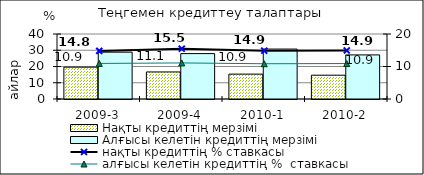
| Category | Нақты кредиттің мерзімі  | Алғысы келетін кредиттің мерзімі  |
|---|---|---|
| 2009-3 | 19.59 | 28.82 |
| 2009-4 | 16.65 | 27.94 |
| 2010-1 | 15.31 | 30.74 |
| 2010-2 | 14.65 | 27.14 |